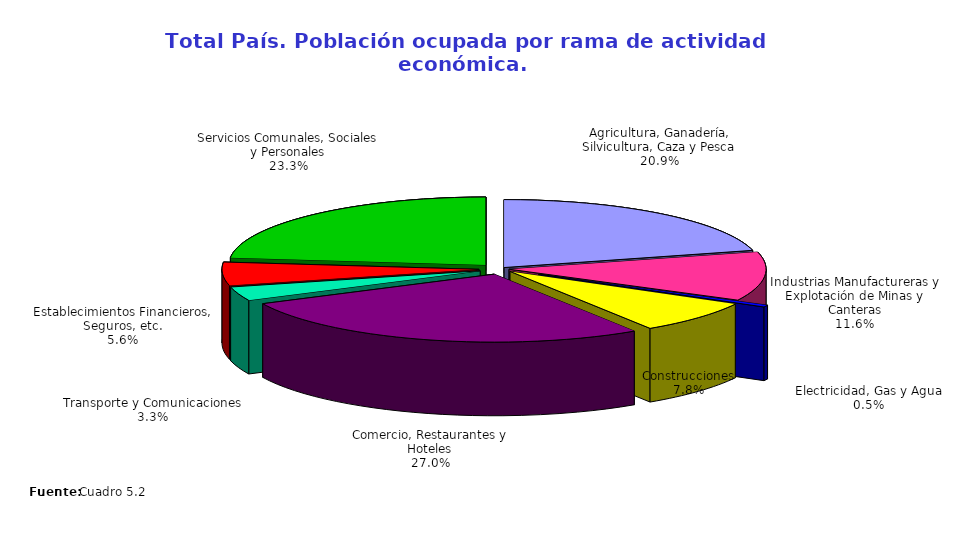
| Category | Series 0 |
|---|---|
| Agricultura, Ganadería, Silvicultura, Caza y Pesca | 691866 |
| Industrias Manufactureras y Explotación de Minas y Canteras | 383315 |
| Electricidad, Gas y Agua | 15345 |
| Construcciones | 259009 |
| Comercio, Restaurantes y Hoteles | 892983 |
| Transporte y Comunicaciones | 109544 |
| Establecimientos Financieros, Seguros, etc. | 183589 |
| Servicios Comunales, Sociales y Personales | 769764 |